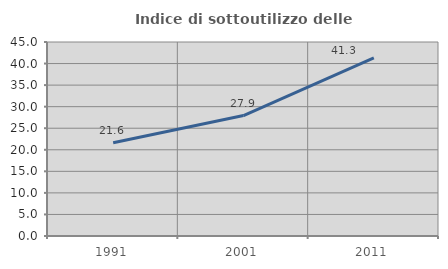
| Category | Indice di sottoutilizzo delle abitazioni  |
|---|---|
| 1991.0 | 21.644 |
| 2001.0 | 27.943 |
| 2011.0 | 41.299 |